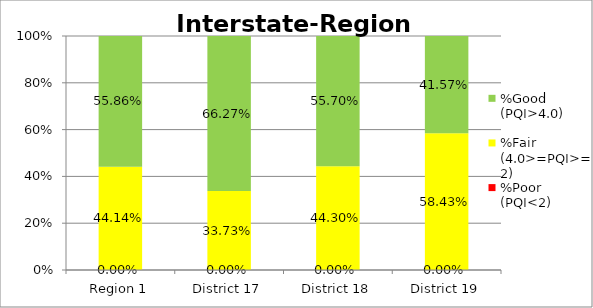
| Category | %Poor
(PQI<2) | %Fair
(4.0>=PQI>=2) | %Good
(PQI>4.0) |
|---|---|---|---|
| Region 1 | 0 | 0.441 | 0.559 |
| District 17 | 0 | 0.337 | 0.663 |
| District 18 | 0 | 0.443 | 0.557 |
| District 19 | 0 | 0.584 | 0.416 |